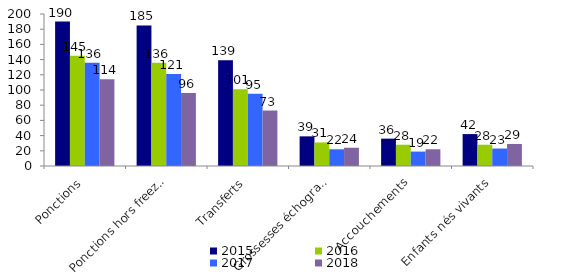
| Category | 2015 | 2016 | 2017 | 2018 |
|---|---|---|---|---|
| Ponctions | 190 | 145 | 136 | 114 |
| Ponctions hors freeze-all* | 185 | 136 | 121 | 96 |
| Transferts | 139 | 101 | 95 | 73 |
| Grossesses échographiques | 39 | 31 | 22 | 24 |
| Accouchements | 36 | 28 | 19 | 22 |
| Enfants nés vivants | 42 | 28 | 23 | 29 |